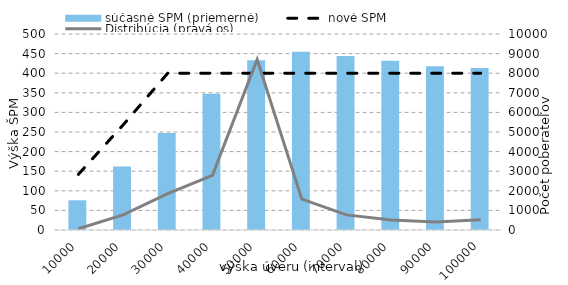
| Category | súčasné ŠPM (priemerné) |
|---|---|
| 10000.0 | 75.816 |
| 20000.0 | 161.933 |
| 30000.0 | 247.505 |
| 40000.0 | 347.266 |
| 50000.0 | 433.063 |
| 60000.0 | 454.599 |
| 70000.0 | 444.075 |
| 80000.0 | 431.873 |
| 90000.0 | 417.869 |
| 100000.0 | 413.336 |